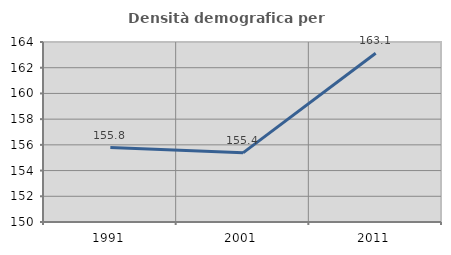
| Category | Densità demografica |
|---|---|
| 1991.0 | 155.788 |
| 2001.0 | 155.38 |
| 2011.0 | 163.129 |